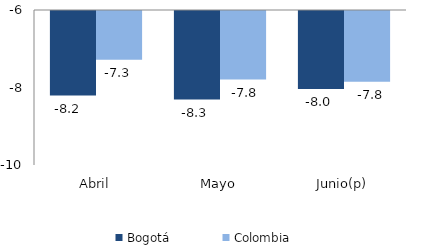
| Category | Bogotá | Colombia |
|---|---|---|
| Abril | -8.182 | -7.258 |
| Mayo | -8.285 | -7.77 |
| Junio(p) | -8.013 | -7.825 |